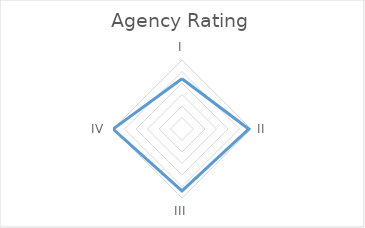
| Category | Series 0 |
|---|---|
| I | 2.182 |
| II | 2.9 |
| III | 2.692 |
| IV | 3 |